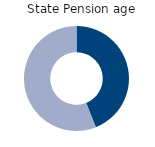
| Category | State Pension age |
|---|---|
| Full-time | 44 |
| Part-time | 56 |